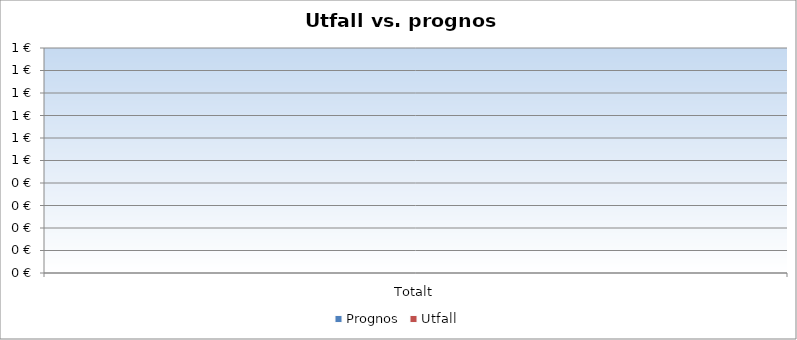
| Category | Prognos | Utfall |
|---|---|---|
| Totalt | 0 | 0 |